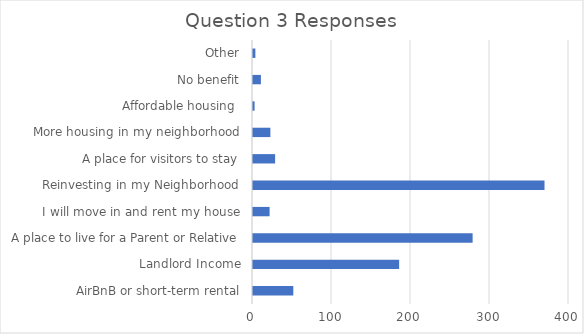
| Category | Series 0 |
|---|---|
| AirBnB or short-term rental | 51 |
| Landlord Income | 185 |
| A place to live for a Parent or Relative | 278 |
| I will move in and rent my house | 21 |
| Reinvesting in my Neighborhood | 369 |
| A place for visitors to stay | 28 |
| More housing in my neighborhood | 22 |
| Affordable housing  | 2 |
| No benefit | 10 |
| Other | 3 |